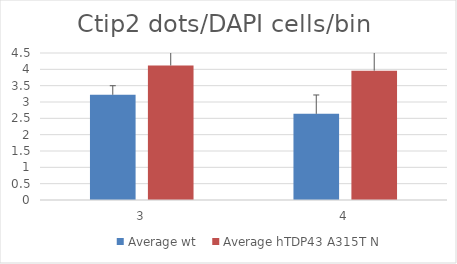
| Category | Average wt | Average hTDP43 A315T N |
|---|---|---|
| 3.0 | 3.22 | 4.118 |
| 4.0 | 2.637 | 3.958 |